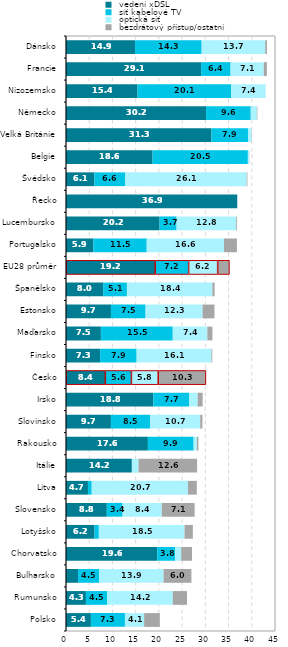
| Category |  vedení xDSL |  síť kabelové TV  |  optická síť  |  bezdrátový přístup/ostatní |
|---|---|---|---|---|
| Polsko | 5.36 | 7.33 | 4.14 | 3.37 |
| Rumunsko | 4.29 | 4.538 | 14.156 | 3.074 |
| Bulharsko | 2.605 | 4.521 | 13.877 | 5.998 |
| Chorvatsko | 19.64 | 3.848 | 1.314 | 2.327 |
| Lotyšsko | 6.15 | 0.92 | 18.46 | 1.78 |
| Slovensko | 8.79 | 3.39 | 8.44 | 7.07 |
| Litva | 4.73 | 0.81 | 20.72 | 1.91 |
| Itálie | 14.18 | 0 | 1.43 | 12.62 |
| Rakousko | 17.63 | 9.85 | 0.71 | 0.32 |
| Slovinsko | 9.67 | 8.49 | 10.74 | 0.47 |
| Irsko | 18.82 | 7.67 | 1.86 | 1.07 |
| Česko | 8.42 | 5.61 | 5.77 | 10.27 |
| Finsko | 7.34 | 7.87 | 16.1 | 0.18 |
| Maďarsko | 7.51 | 15.48 | 7.44 | 1.09 |
| Estonsko | 9.68 | 7.45 | 12.27 | 2.56 |
| Španělsko | 8 | 5.12 | 18.4 | 0.48 |
| EU28 průměr | 19.157 | 7.2 | 6.244 | 2.536 |
| Portugalsko | 5.9 | 11.48 | 16.63 | 2.79 |
| Lucembursko | 20.15 | 3.66 | 12.84 | 0.18 |
| Řecko | 36.85 | 0 | 0.06 | 0.05 |
| Švédsko | 6.13 | 6.64 | 26.14 | 0.14 |
| Belgie | 18.64 | 20.52 | 0.28 | 0.04 |
| Velká Británie | 31.32 | 7.86 | 0.77 | 0.05 |
| Německo | 30.15 | 9.63 | 1.31 | 0.11 |
| Nizozemsko | 15.4 | 20.14 | 7.43 | 0.01 |
| Francie | 29.08 | 6.36 | 7.14 | 0.67 |
| Dánsko | 14.87 | 14.34 | 13.68 | 0.37 |